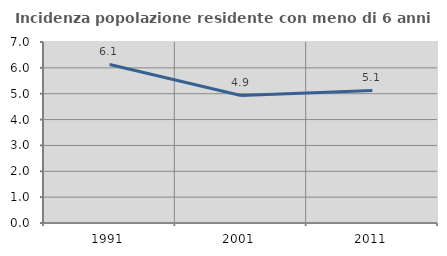
| Category | Incidenza popolazione residente con meno di 6 anni |
|---|---|
| 1991.0 | 6.133 |
| 2001.0 | 4.933 |
| 2011.0 | 5.127 |